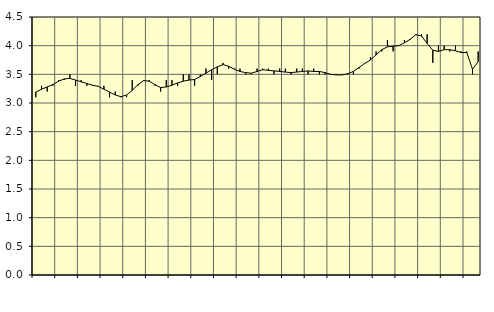
| Category | Piggar | Personliga och kulturella tjänster, SNI 90-98 |
|---|---|---|
| nan | 3.1 | 3.19 |
| 1.0 | 3.3 | 3.24 |
| 1.0 | 3.2 | 3.28 |
| 1.0 | 3.3 | 3.32 |
| nan | 3.4 | 3.38 |
| 2.0 | 3.4 | 3.42 |
| 2.0 | 3.5 | 3.43 |
| 2.0 | 3.3 | 3.4 |
| nan | 3.4 | 3.37 |
| 3.0 | 3.3 | 3.34 |
| 3.0 | 3.3 | 3.31 |
| 3.0 | 3.3 | 3.29 |
| nan | 3.3 | 3.24 |
| 4.0 | 3.1 | 3.19 |
| 4.0 | 3.2 | 3.14 |
| 4.0 | 3.1 | 3.11 |
| nan | 3.1 | 3.14 |
| 5.0 | 3.4 | 3.22 |
| 5.0 | 3.3 | 3.32 |
| 5.0 | 3.4 | 3.39 |
| nan | 3.4 | 3.38 |
| 6.0 | 3.3 | 3.32 |
| 6.0 | 3.2 | 3.27 |
| 6.0 | 3.4 | 3.28 |
| nan | 3.4 | 3.31 |
| 7.0 | 3.3 | 3.35 |
| 7.0 | 3.5 | 3.38 |
| 7.0 | 3.5 | 3.4 |
| nan | 3.3 | 3.41 |
| 8.0 | 3.5 | 3.46 |
| 8.0 | 3.6 | 3.52 |
| 8.0 | 3.4 | 3.58 |
| nan | 3.5 | 3.63 |
| 9.0 | 3.7 | 3.67 |
| 9.0 | 3.6 | 3.64 |
| 9.0 | 3.6 | 3.59 |
| nan | 3.6 | 3.55 |
| 10.0 | 3.5 | 3.53 |
| 10.0 | 3.5 | 3.52 |
| 10.0 | 3.6 | 3.55 |
| nan | 3.6 | 3.58 |
| 11.0 | 3.6 | 3.57 |
| 11.0 | 3.5 | 3.56 |
| 11.0 | 3.6 | 3.55 |
| nan | 3.6 | 3.54 |
| 12.0 | 3.5 | 3.53 |
| 12.0 | 3.6 | 3.54 |
| 12.0 | 3.6 | 3.55 |
| nan | 3.5 | 3.56 |
| 13.0 | 3.6 | 3.55 |
| 13.0 | 3.5 | 3.55 |
| 13.0 | 3.5 | 3.53 |
| nan | 3.5 | 3.5 |
| 14.0 | 3.5 | 3.49 |
| 14.0 | 3.5 | 3.49 |
| 14.0 | 3.5 | 3.51 |
| nan | 3.5 | 3.55 |
| 15.0 | 3.6 | 3.62 |
| 15.0 | 3.7 | 3.69 |
| 15.0 | 3.8 | 3.75 |
| nan | 3.9 | 3.84 |
| 16.0 | 3.9 | 3.93 |
| 16.0 | 4.1 | 3.98 |
| 16.0 | 3.9 | 3.99 |
| nan | 4 | 4 |
| 17.0 | 4.1 | 4.05 |
| 17.0 | 4.1 | 4.11 |
| 17.0 | 4.2 | 4.19 |
| nan | 4.2 | 4.17 |
| 18.0 | 4.2 | 4.04 |
| 18.0 | 3.7 | 3.92 |
| 18.0 | 4 | 3.9 |
| nan | 4 | 3.93 |
| 19.0 | 3.9 | 3.93 |
| 19.0 | 4 | 3.91 |
| 19.0 | 3.9 | 3.88 |
| nan | 3.9 | 3.88 |
| 20.0 | 3.5 | 3.59 |
| 20.0 | 3.9 | 3.72 |